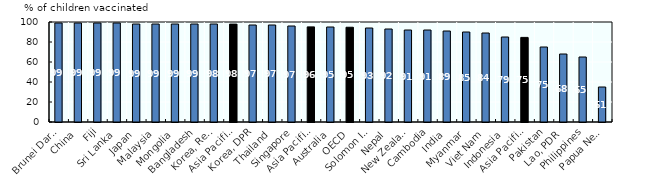
| Category | Series 0 |
|---|---|
| Papua New Guinea | 35 |
| Philippines | 65 |
| Lao, PDR | 68 |
| Pakistan | 75 |
| Asia Pacific-LM/L | 84.6 |
| Indonesia | 85 |
| Viet Nam | 89 |
| Myanmar | 90 |
| India | 91 |
| Cambodia | 92 |
| New Zealand | 92 |
| Nepal | 93 |
| Solomon Islands | 94 |
| OECD | 94.757 |
| Australia | 95 |
| Asia Pacific-H | 95.1 |
| Singapore | 96 |
| Thailand | 97 |
| Korea, DPR | 97 |
| Asia Pacific-UM | 97.9 |
| Korea, Rep. | 98 |
| Bangladesh | 98 |
| Mongolia | 98 |
| Malaysia | 98 |
| Japan | 98 |
| Sri Lanka | 99 |
| Fiji | 99 |
| China | 99 |
| Brunei Darussalam | 99 |